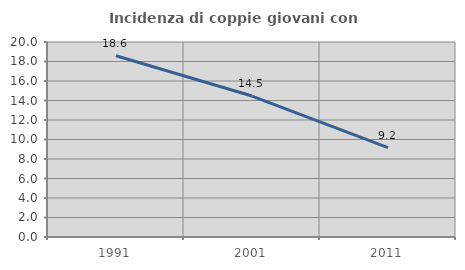
| Category | Incidenza di coppie giovani con figli |
|---|---|
| 1991.0 | 18.584 |
| 2001.0 | 14.455 |
| 2011.0 | 9.176 |